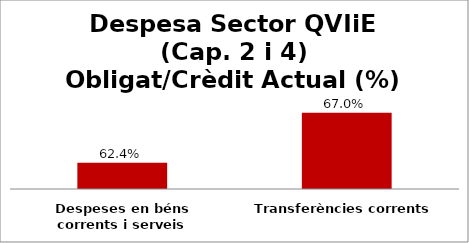
| Category | Series 0 |
|---|---|
| Despeses en béns corrents i serveis | 0.624 |
| Transferències corrents | 0.67 |